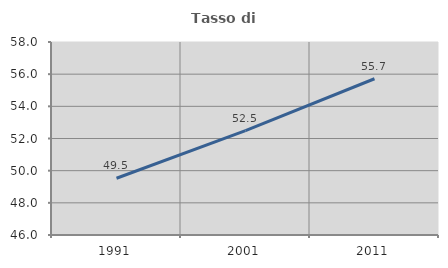
| Category | Tasso di occupazione   |
|---|---|
| 1991.0 | 49.528 |
| 2001.0 | 52.487 |
| 2011.0 | 55.715 |